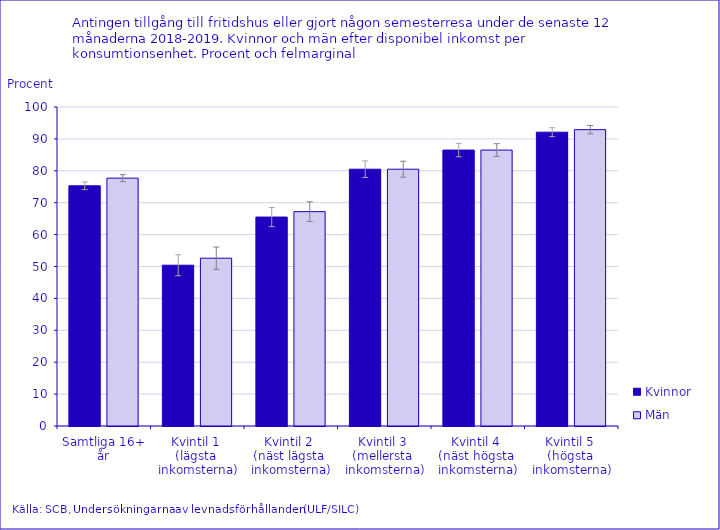
| Category | Kvinnor | Män |
|---|---|---|
| Samtliga 16+ år | 75.3 | 77.7 |
| Kvintil 1 
(lägsta 
inkomsterna) | 50.4 | 52.6 |
| Kvintil 2 
(näst lägsta 
inkomsterna) | 65.5 | 67.2 |
| Kvintil 3 
(mellersta 
inkomsterna) | 80.5 | 80.5 |
| Kvintil 4 
(näst högsta 
inkomsterna) | 86.5 | 86.5 |
| Kvintil 5 
(högsta 
inkomsterna) | 92.1 | 92.9 |